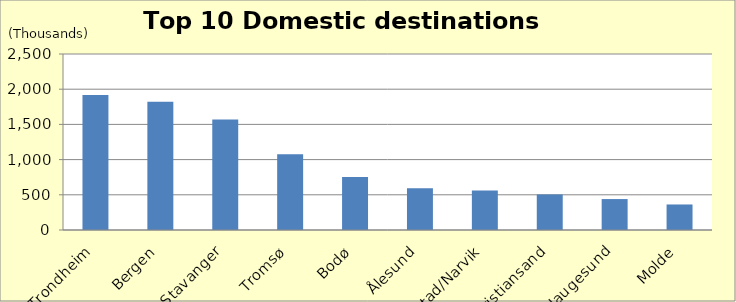
| Category | Number of passengers |
|---|---|
| Trondheim | 1917.812 |
| Bergen | 1822.802 |
| Stavanger | 1569.809 |
| Tromsø | 1076.382 |
| Bodø | 753.81 |
| Ålesund | 593.47 |
| Harstad/Narvik | 559.542 |
| Kristiansand | 504.737 |
| Haugesund | 439.492 |
| Molde | 362.602 |